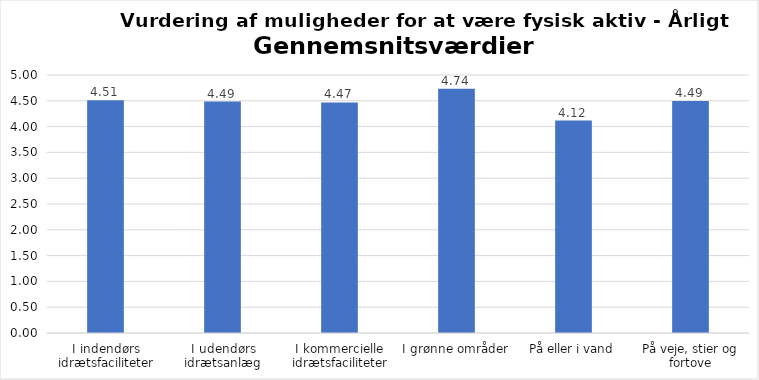
| Category | Gennemsnit |
|---|---|
| I indendørs idrætsfaciliteter | 4.51 |
| I udendørs idrætsanlæg | 4.486 |
| I kommercielle idrætsfaciliteter | 4.469 |
| I grønne områder | 4.736 |
| På eller i vand | 4.117 |
| På veje, stier og fortove | 4.494 |